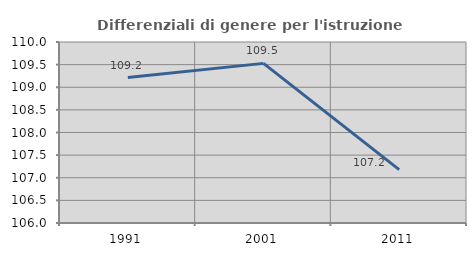
| Category | Differenziali di genere per l'istruzione superiore |
|---|---|
| 1991.0 | 109.214 |
| 2001.0 | 109.528 |
| 2011.0 | 107.178 |